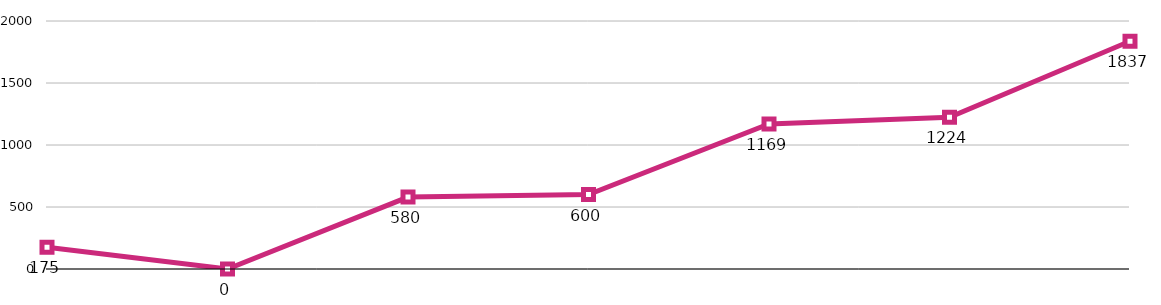
| Category | Totals |
|---|---|
|  | 175 |
|  | 0 |
|  | 580 |
|  | 600 |
|  | 1169 |
|  | 1224 |
|  | 1837 |